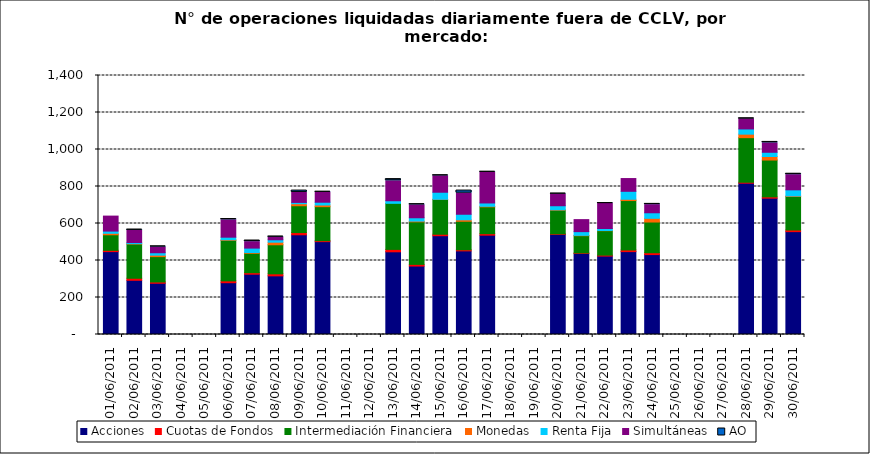
| Category | Acciones | Cuotas de Fondos | Intermediación Financiera | Monedas | Renta Fija | Simultáneas | AO |
|---|---|---|---|---|---|---|---|
| 01/06/2011 | 448 | 7 | 84 | 8 | 12 | 81 | 0 |
| 02/06/2011 | 293 | 11 | 185 | 2 | 6 | 66 | 4 |
| 03/06/2011 | 277 | 7 | 137 | 8 | 13 | 31 | 3 |
| 06/06/2011 | 280 | 10 | 219 | 3 | 14 | 94 | 4 |
| 07/06/2011 | 326 | 8 | 105 | 4 | 24 | 35 | 6 |
| 08/06/2011 | 317 | 11 | 157 | 14 | 13 | 14 | 3 |
| 09/06/2011 | 539 | 12 | 145 | 11 | 7 | 54 | 10 |
| 10/06/2011 | 502 | 5 | 184 | 9 | 15 | 54 | 2 |
| 13/06/2011 | 447 | 13 | 249 | 0 | 14 | 108 | 9 |
| 14/06/2011 | 370 | 9 | 230 | 4 | 18 | 70 | 3 |
| 15/06/2011 | 534 | 8 | 188 | 1 | 38 | 89 | 2 |
| 16/06/2011 | 452 | 6 | 154 | 8 | 30 | 114 | 14 |
| 17/06/2011 | 537 | 8 | 145 | 3 | 18 | 166 | 2 |
| 20/06/2011 | 541 | 3 | 128 | 2 | 22 | 63 | 2 |
| 21/06/2011 | 438 | 3 | 93 | 2 | 20 | 65 | 0 |
| 22/06/2011 | 424 | 5 | 132 | 1 | 11 | 135 | 2 |
| 23/06/2011 | 448 | 9 | 267 | 7 | 43 | 69 | 0 |
| 24/06/2011 | 432 | 10 | 166 | 20 | 30 | 44 | 4 |
| 28/06/2011 | 818 | 5 | 241 | 19 | 28 | 55 | 1 |
| 29/06/2011 | 737 | 7 | 199 | 19 | 23 | 51 | 5 |
| 30/06/2011 | 556 | 9 | 181 | 3 | 33 | 82 | 5 |